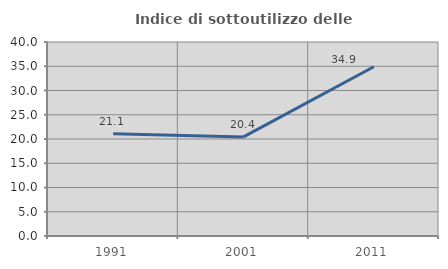
| Category | Indice di sottoutilizzo delle abitazioni  |
|---|---|
| 1991.0 | 21.073 |
| 2001.0 | 20.438 |
| 2011.0 | 34.896 |